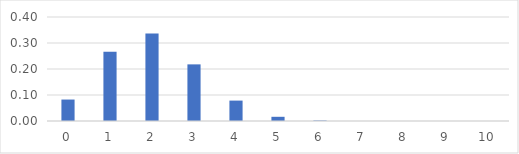
| Category | Series 0 |
|---|---|
| 0.0 | 0.083 |
| 1.0 | 0.266 |
| 2.0 | 0.337 |
| 3.0 | 0.218 |
| 4.0 | 0.078 |
| 5.0 | 0.016 |
| 6.0 | 0.002 |
| 7.0 | 0 |
| 8.0 | 0 |
| 9.0 | 0 |
| 10.0 | 0 |